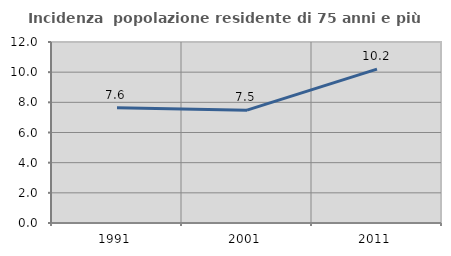
| Category | Incidenza  popolazione residente di 75 anni e più |
|---|---|
| 1991.0 | 7.634 |
| 2001.0 | 7.481 |
| 2011.0 | 10.199 |